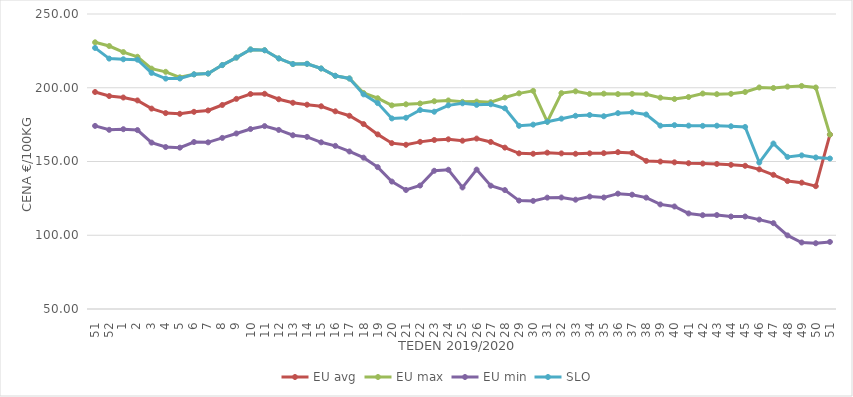
| Category | EU avg | EU max | EU min | SLO |
|---|---|---|---|---|
| 51.0 | 197.12 | 230.81 | 174.14 | 227 |
| 52.0 | 194.37 | 228.29 | 171.48 | 219.77 |
| 1.0 | 193.377 | 224.192 | 171.9 | 219.3 |
| 2.0 | 191.401 | 221 | 171.3 | 219.04 |
| 3.0 | 185.853 | 212.939 | 162.8 | 210.06 |
| 4.0 | 182.823 | 210.79 | 159.8 | 206.21 |
| 5.0 | 182.323 | 207.07 | 159.4 | 206.26 |
| 6.0 | 183.683 | 209.09 | 163.2 | 209.09 |
| 7.0 | 184.611 | 209.63 | 163 | 209.63 |
| 8.0 | 188.308 | 215.37 | 166 | 215.37 |
| 9.0 | 192.461 | 220.46 | 169 | 220.46 |
| 10.0 | 195.739 | 225.94 | 172 | 225.94 |
| 11.0 | 195.907 | 225.42 | 174 | 225.42 |
| 12.0 | 192.207 | 219.88 | 171.4 | 219.88 |
| 13.0 | 189.812 | 216.08 | 167.8 | 216.08 |
| 14.0 | 188.513 | 216.22 | 166.7 | 216.22 |
| 15.0 | 187.445 | 213.05 | 163 | 213.05 |
| 16.0 | 184.026 | 208.1 | 160.6 | 208.1 |
| 17.0 | 181.02 | 206.28 | 156.8 | 206.28 |
| 18.0 | 175.386 | 196.433 | 152.6 | 195.51 |
| 19.0 | 168.376 | 192.882 | 146.2 | 189.59 |
| 20.0 | 162.44 | 188.064 | 136.4 | 179.2 |
| 21.0 | 161.336 | 188.786 | 130.7 | 179.64 |
| 22.0 | 163.316 | 189.324 | 133.7 | 184.89 |
| 23.0 | 164.576 | 190.87 | 143.7 | 183.75 |
| 24.0 | 165.057 | 191.384 | 144.4 | 188.07 |
| 25.0 | 164.104 | 190.464 | 132.4 | 189.46 |
| 26.0 | 165.536 | 190.617 | 144.5 | 188.4 |
| 27.0 | 163.253 | 190.19 | 133.59 | 188.81 |
| 28.0 | 159.412 | 193.412 | 130.64 | 186.1 |
| 29.0 | 155.543 | 196.21 | 123.5 | 174.2 |
| 30.0 | 155.244 | 197.882 | 123.3 | 174.99 |
| 31.0 | 155.999 | 176.94 | 125.5 | 176.94 |
| 32.0 | 155.502 | 196.36 | 125.6 | 179.04 |
| 33.0 | 155.24 | 197.575 | 124.1 | 180.99 |
| 34.0 | 155.534 | 195.811 | 126.2 | 181.53 |
| 35.0 | 155.666 | 195.99 | 125.6 | 180.69 |
| 36.0 | 156.337 | 195.69 | 128.2 | 182.79 |
| 37.0 | 155.807 | 195.864 | 127.5 | 183.3 |
| 38.0 | 150.394 | 195.644 | 125.5 | 181.87 |
| 39.0 | 149.957 | 193.273 | 120.9 | 174.3 |
| 40.0 | 149.446 | 192.354 | 119.5 | 174.65 |
| 41.0 | 148.828 | 193.719 | 114.8 | 174.32 |
| 42.0 | 148.604 | 196.067 | 113.6 | 174.16 |
| 43.0 | 148.334 | 195.646 | 113.7 | 174.26 |
| 44.0 | 147.74 | 195.895 | 112.7 | 173.88 |
| 45.0 | 147.092 | 197.12 | 112.7 | 173.41 |
| 46.0 | 144.681 | 200.19 | 110.6 | 149.29 |
| 47.0 | 140.978 | 199.838 | 108.2 | 162.18 |
| 48.0 | 136.736 | 200.751 | 99.9 | 153.11 |
| 49.0 | 135.656 | 201.22 | 95.1 | 154.15 |
| 50.0 | 133.276 | 200.177 | 94.6 | 152.74 |
| 51.0 | 168.213 | 168.213 | 95.5 | 152.03 |